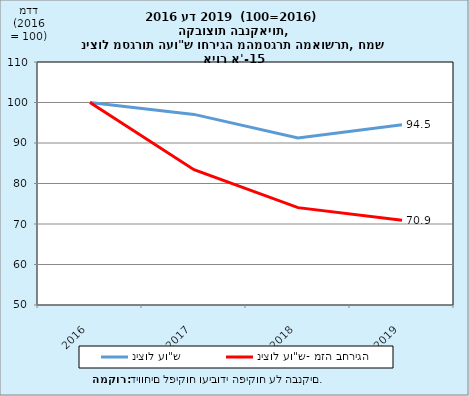
| Category | ניצול עו"ש | ניצול עו"ש- מזה בחריגה |
|---|---|---|
| 2016.0 | 100 | 100 |
| 2017.0 | 97.061 | 83.409 |
| 2018.0 | 91.26 | 74.046 |
| 2019.0 | 94.48 | 70.9 |